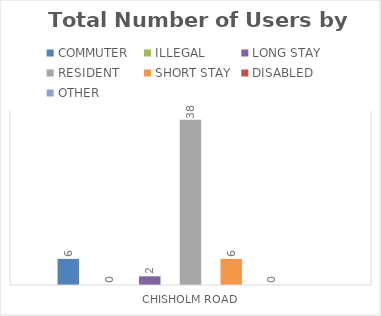
| Category | COMMUTER | ILLEGAL | LONG STAY | RESIDENT | SHORT STAY | DISABLED | OTHER |
|---|---|---|---|---|---|---|---|
| CHISHOLM ROAD | 6 | 0 | 2 | 38 | 6 | 0 | 0 |